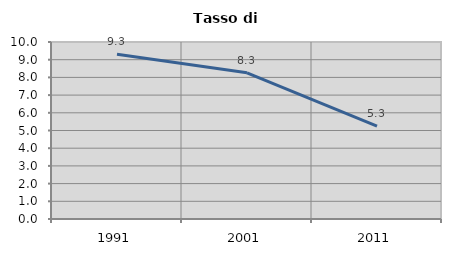
| Category | Tasso di disoccupazione   |
|---|---|
| 1991.0 | 9.307 |
| 2001.0 | 8.259 |
| 2011.0 | 5.252 |